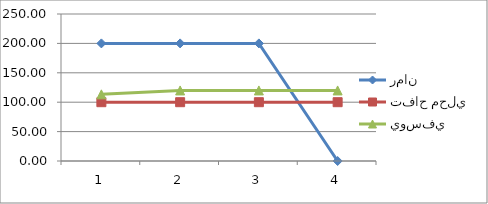
| Category | رمان | تفاح محلي | يوسفي |
|---|---|---|---|
| 0 | 200 | 100 | 113.33 |
| 1 | 200 | 100 | 120 |
| 2 | 200 | 100 | 120 |
| 3 | 0 | 100 | 120 |